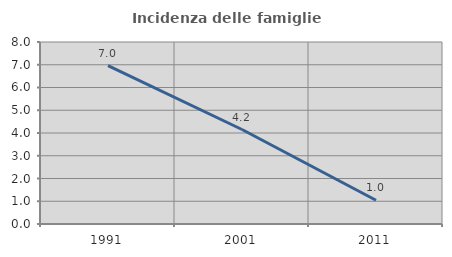
| Category | Incidenza delle famiglie numerose |
|---|---|
| 1991.0 | 6.965 |
| 2001.0 | 4.154 |
| 2011.0 | 1.044 |